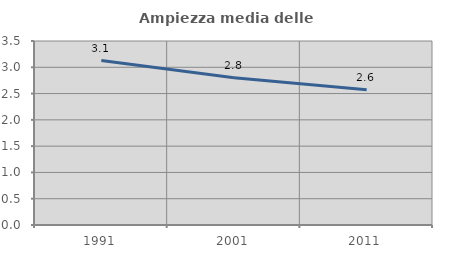
| Category | Ampiezza media delle famiglie |
|---|---|
| 1991.0 | 3.128 |
| 2001.0 | 2.799 |
| 2011.0 | 2.574 |